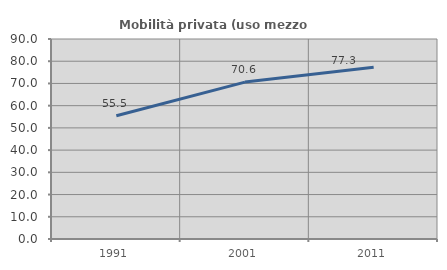
| Category | Mobilità privata (uso mezzo privato) |
|---|---|
| 1991.0 | 55.491 |
| 2001.0 | 70.603 |
| 2011.0 | 77.28 |